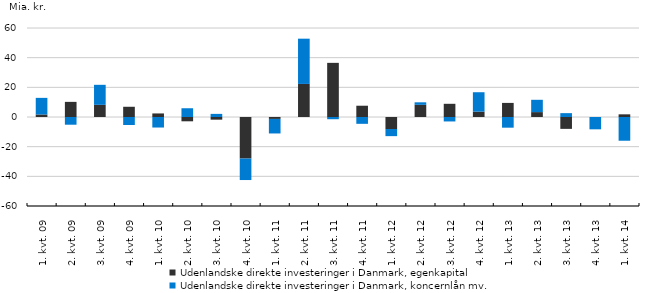
| Category | Udenlandske direkte investeringer i Danmark, egenkapital | Udenlandske direkte investeringer i Danmark, koncernlån mv. |
|---|---|---|
| 1. kvt. 09 | 1.7 | 11.2 |
| 2. kvt. 09 | 10.2 | -5.2 |
| 3. kvt. 09 | 8.2 | 13.5 |
| 4. kvt. 09 | 6.9 | -5.4 |
| 1. kvt. 10 | 2.4 | -7.1 |
| 2. kvt. 10 | -2.9 | 5.9 |
| 3. kvt. 10 | -1.8 | 2.1 |
| 4. kvt. 10 | -28 | -14.5 |
| 1. kvt. 11 | -1.3 | -9.8 |
| 2. kvt. 11 | 22.3 | 30.5 |
| 3. kvt. 11 | 36.5 | -1.5 |
| 4. kvt. 11 | 7.6 | -4.6 |
| 1. kvt. 12 | -8.1 | -4.8 |
| 2. kvt. 12 | 8.2 | 1.7 |
| 3. kvt. 12 | 8.9 | -3 |
| 4. kvt. 12 | 3.6 | 13.1 |
| 1. kvt. 13 | 9.5 | -7.2 |
| 2. kvt. 13 | 3.3 | 8.3 |
| 3. kvt. 13 | -8 | 2.6 |
| 4. kvt. 13 | 0 | -8.3 |
| 1. kvt. 14 | 1.8 | -16 |